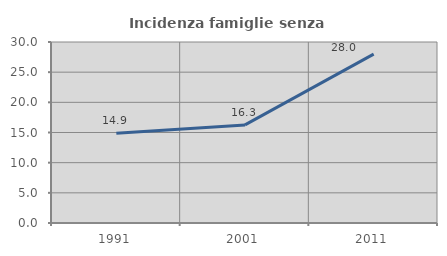
| Category | Incidenza famiglie senza nuclei |
|---|---|
| 1991.0 | 14.856 |
| 2001.0 | 16.254 |
| 2011.0 | 28 |